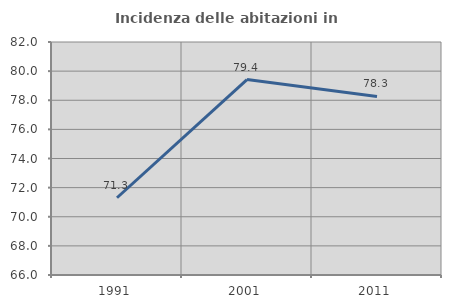
| Category | Incidenza delle abitazioni in proprietà  |
|---|---|
| 1991.0 | 71.306 |
| 2001.0 | 79.42 |
| 2011.0 | 78.261 |